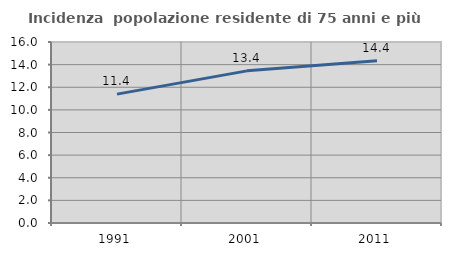
| Category | Incidenza  popolazione residente di 75 anni e più |
|---|---|
| 1991.0 | 11.391 |
| 2001.0 | 13.449 |
| 2011.0 | 14.353 |